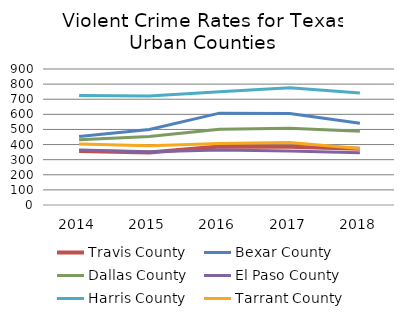
| Category | Travis County | Bexar County | Dallas County | El Paso County | Harris County | Tarrant County |
|---|---|---|---|---|---|---|
| 2014.0 | 357 | 454 | 431.357 | 364 | 725 | 403 |
| 2015.0 | 348 | 500 | 454 | 352 | 722 | 392 |
| 2016.0 | 387.428 | 607.909 | 501.381 | 364.356 | 749.252 | 407.443 |
| 2017.0 | 385.511 | 605.894 | 508.675 | 357.81 | 776.422 | 412.975 |
| 2018.0 | 371.5 | 540.98 | 488.02 | 345.84 | 740.79 | 374.01 |